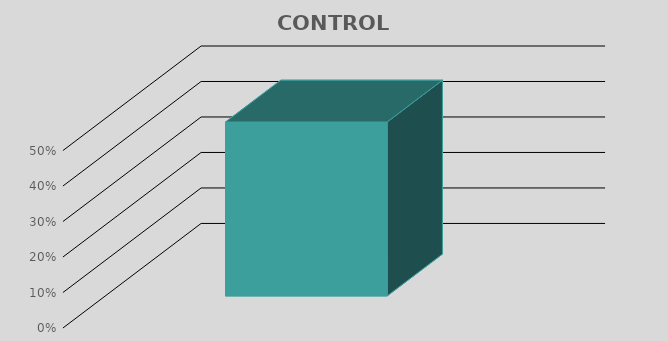
| Category | CONTROL INTERNO |
|---|---|
| 0 | 0.49 |